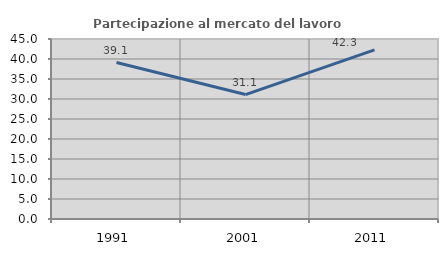
| Category | Partecipazione al mercato del lavoro  femminile |
|---|---|
| 1991.0 | 39.118 |
| 2001.0 | 31.111 |
| 2011.0 | 42.297 |